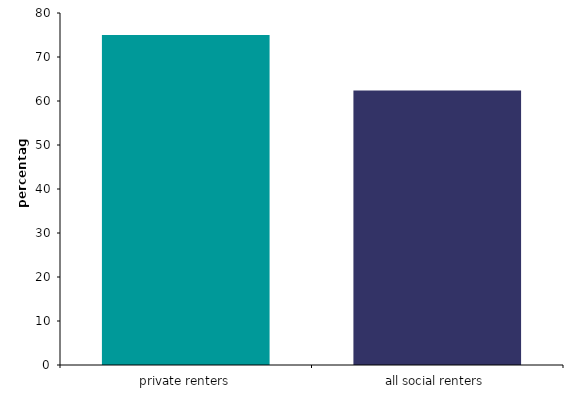
| Category | Series 0 |
|---|---|
| all social renters | 62.366 |
| private renters | 75.001 |